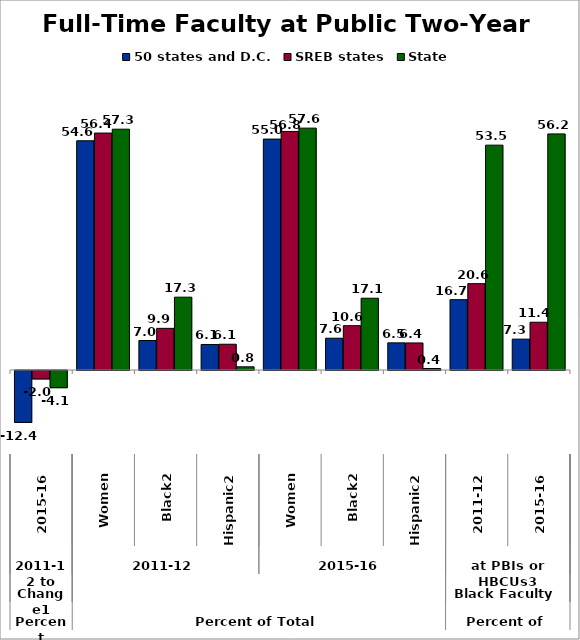
| Category | 50 states and D.C. | SREB states | State |
|---|---|---|---|
| 0 | -12.357 | -2.011 | -4.095 |
| 1 | 54.579 | 56.41 | 57.333 |
| 2 | 7.023 | 9.915 | 17.338 |
| 3 | 6.079 | 6.135 | 0.759 |
| 4 | 54.978 | 56.8 | 57.588 |
| 5 | 7.566 | 10.551 | 17.089 |
| 6 | 6.465 | 6.441 | 0.354 |
| 7 | 16.749 | 20.559 | 53.535 |
| 8 | 7.349 | 11.37 | 56.207 |